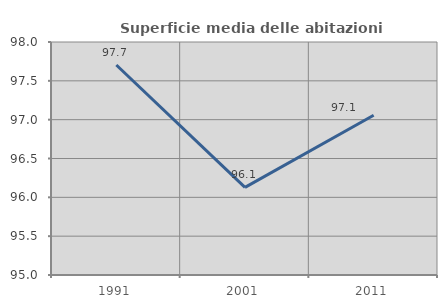
| Category | Superficie media delle abitazioni occupate |
|---|---|
| 1991.0 | 97.704 |
| 2001.0 | 96.128 |
| 2011.0 | 97.056 |